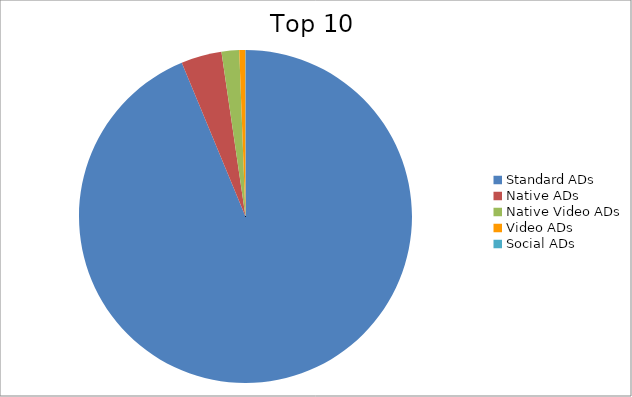
| Category | Series 0 |
|---|---|
| Standard ADs | 93.74 |
| Native ADs | 3.94 |
| Native Video ADs | 1.71 |
| Video ADs | 0.58 |
| Social ADs | 0.02 |